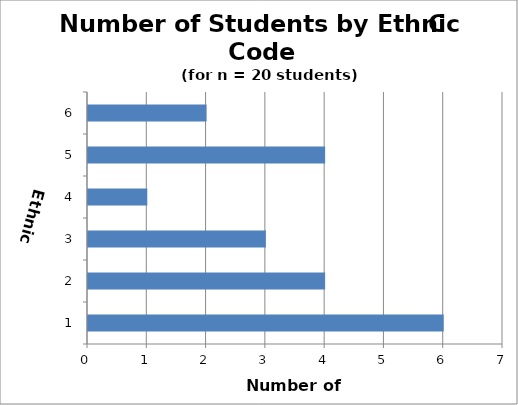
| Category | Ethnicity |
|---|---|
| 1.0 | 6 |
| 2.0 | 4 |
| 3.0 | 3 |
| 4.0 | 1 |
| 5.0 | 4 |
| 6.0 | 2 |